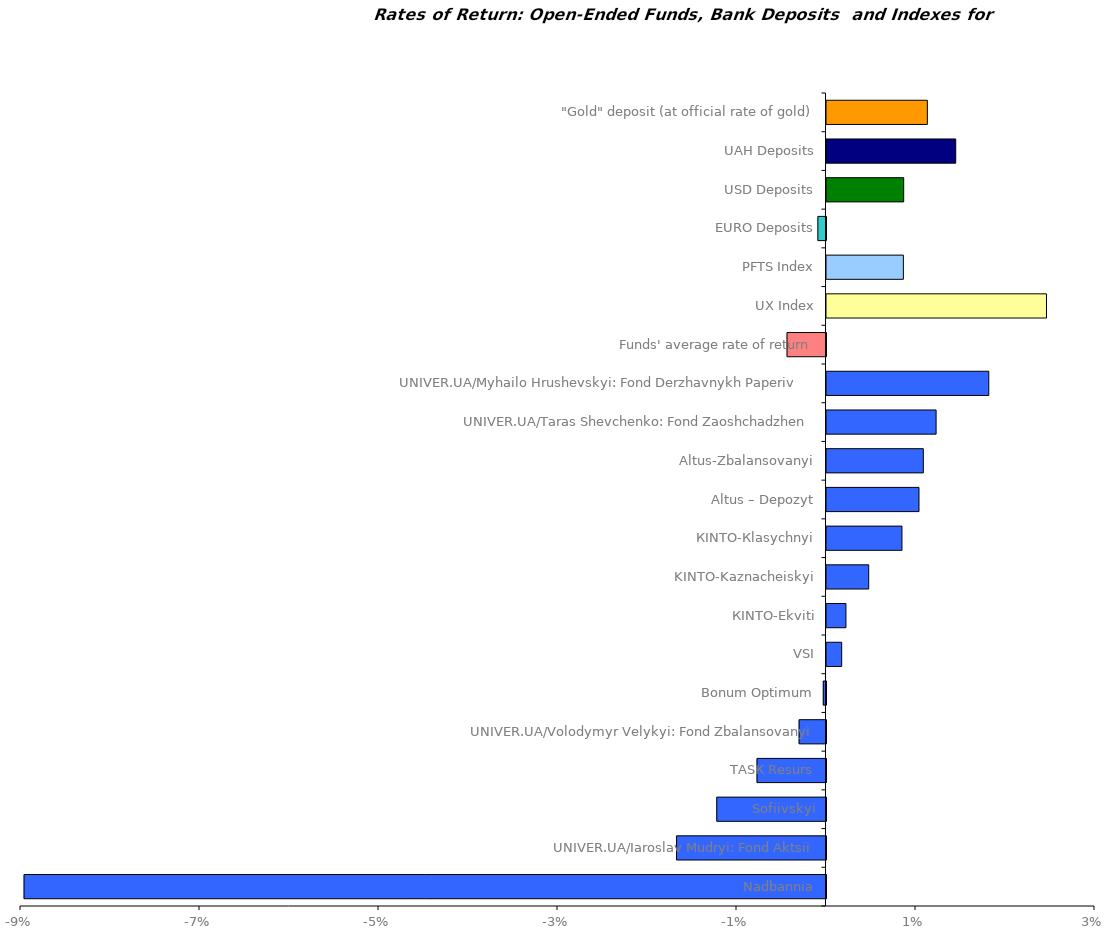
| Category | Series 0 |
|---|---|
| Nadbannia | -0.09 |
| UNIVER.UA/Iaroslav Mudryi: Fond Aktsii | -0.017 |
| Sofiivskyi | -0.012 |
| ТАSК Resurs | -0.008 |
| UNIVER.UA/Volodymyr Velykyi: Fond Zbalansovanyi | -0.003 |
| Bonum Optimum | 0 |
| VSI | 0.002 |
| КІNТО-Еkviti | 0.002 |
| KINTO-Kaznacheiskyi | 0.005 |
| КІNТО-Кlasychnyi | 0.008 |
| Altus – Depozyt | 0.01 |
| Аltus-Zbalansovanyi | 0.011 |
| UNIVER.UA/Taras Shevchenko: Fond Zaoshchadzhen | 0.012 |
| UNIVER.UA/Myhailo Hrushevskyi: Fond Derzhavnykh Paperiv    | 0.018 |
| Funds' average rate of return | -0.004 |
| UX Index | 0.025 |
| PFTS Index | 0.009 |
| EURO Deposits | -0.001 |
| USD Deposits | 0.009 |
| UAH Deposits | 0.014 |
| "Gold" deposit (at official rate of gold) | 0.011 |